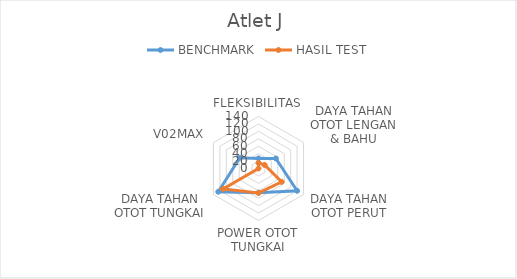
| Category | BENCHMARK | HASIL TEST |
|---|---|---|
| 0 | 27 | 15 |
| 1 | 54 | 19 |
| 2 | 120 | 72 |
| 3 | 65 | 66 |
| 4 | 125 | 110 |
| 5 | 58 | 0 |